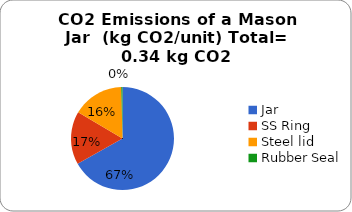
| Category | Series 0 |
|---|---|
| Jar | 0.229 |
| SS Ring | 0.057 |
| Steel lid | 0.055 |
| Rubber Seal | 0.001 |